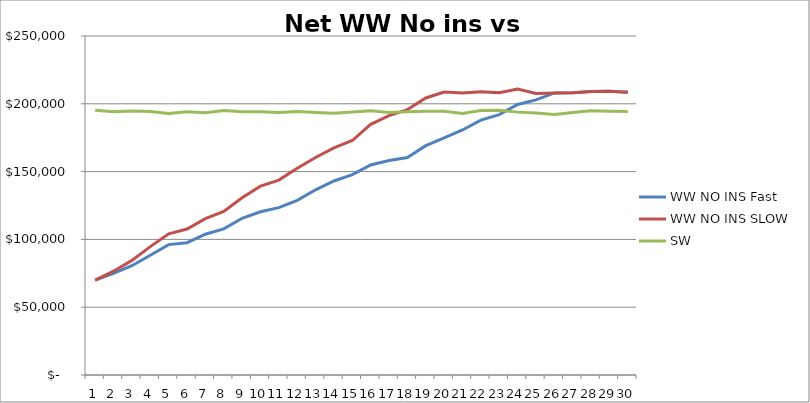
| Category | WW NO INS Fast | WW NO INS SLOW | SW |
|---|---|---|---|
| 0 | 69953.713 | 69953.713 | 195175.851 |
| 1 | 75007.261 | 76561.926 | 194104.246 |
| 2 | 80578.317 | 84527.171 | 194744.599 |
| 3 | 88330.578 | 94690.93 | 194333.973 |
| 4 | 96166.905 | 104130.981 | 192877.631 |
| 5 | 97595.964 | 107631.428 | 194155.959 |
| 6 | 103840.791 | 115260.961 | 193416.288 |
| 7 | 107776.231 | 120577.458 | 194966.982 |
| 8 | 115563.904 | 130677.462 | 194221.382 |
| 9 | 120375.515 | 139261.901 | 194206.051 |
| 10 | 123453.294 | 143769.353 | 193618.043 |
| 11 | 128744.909 | 152429.338 | 194278.927 |
| 12 | 136569.669 | 160411.654 | 193671.167 |
| 13 | 143091.637 | 167487.102 | 192966.138 |
| 14 | 147817.525 | 172930.747 | 193993.938 |
| 15 | 154924.192 | 184820.172 | 194885.332 |
| 16 | 158197.902 | 191338.204 | 193671.929 |
| 17 | 160401.619 | 195706.234 | 194083.72 |
| 18 | 169134.934 | 204306.091 | 194542.159 |
| 19 | 174843.227 | 208682.861 | 194465.101 |
| 20 | 180694.286 | 208051.053 | 192943.034 |
| 21 | 187951.121 | 208951.276 | 194973.573 |
| 22 | 192044.472 | 208205.369 | 195259.768 |
| 23 | 199483.376 | 210911.679 | 193859.046 |
| 24 | 202851.26 | 207556.765 | 193158.349 |
| 25 | 208019.732 | 208019.732 | 192102.9 |
| 26 | 208146.286 | 208146.286 | 193631.378 |
| 27 | 209118.235 | 209118.235 | 194912.231 |
| 28 | 209182.6 | 209182.6 | 194443.482 |
| 29 | 208534.952 | 208534.952 | 194254.437 |